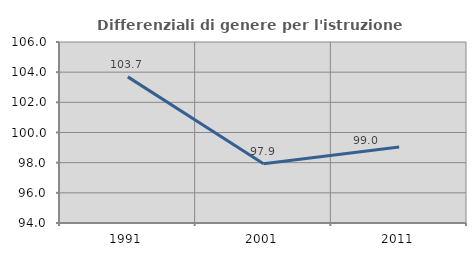
| Category | Differenziali di genere per l'istruzione superiore |
|---|---|
| 1991.0 | 103.688 |
| 2001.0 | 97.921 |
| 2011.0 | 99.037 |